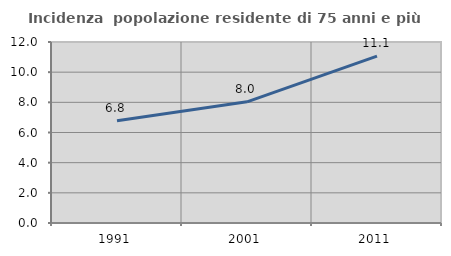
| Category | Incidenza  popolazione residente di 75 anni e più |
|---|---|
| 1991.0 | 6.774 |
| 2001.0 | 8.032 |
| 2011.0 | 11.064 |